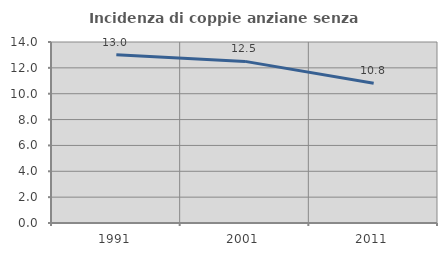
| Category | Incidenza di coppie anziane senza figli  |
|---|---|
| 1991.0 | 13.008 |
| 2001.0 | 12.5 |
| 2011.0 | 10.804 |